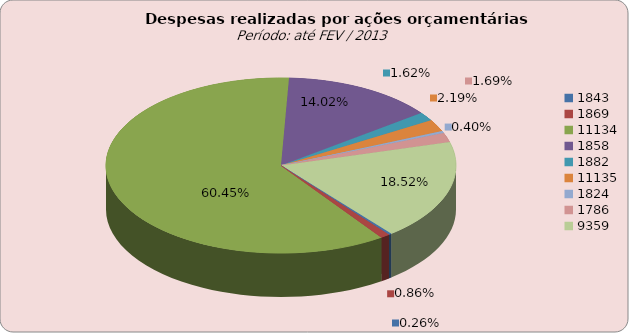
| Category | Series 0 | Series 1 |
|---|---|---|
| 1843.0 | 81117.02 | 81117.02 |
| 1869.0 | 266721.9 | 266721.9 |
| 11134.0 | 18833650.54 | 18833650.54 |
| 1858.0 | 4368548.35 | 4368548.35 |
| 1882.0 | 503655.42 | 503655.42 |
| 11135.0 | 680866.72 | 680866.72 |
| 1824.0 | 124631.7 | 124631.7 |
| 1786.0 | 527971.91 | 527971.91 |
| 9359.0 | 5768698.65 | 5768698.65 |